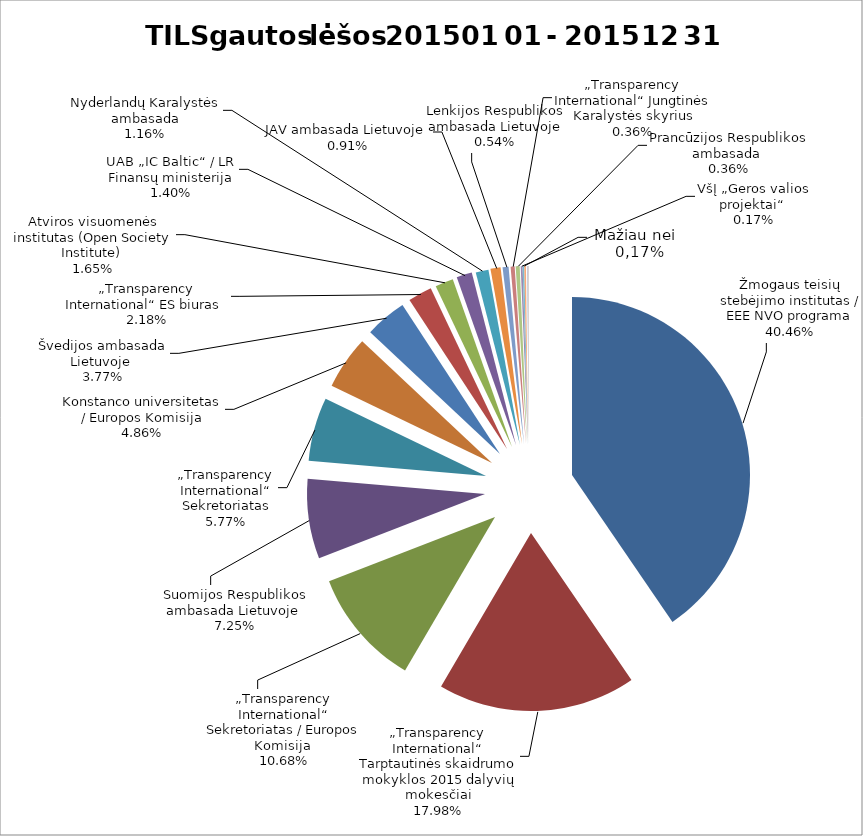
| Category | Series 0 |
|---|---|
| Žmogaus teisių stebėjimo institutas / EEE NVO programa | 0.405 |
| „Transparency International“ Tarptautinės skaidrumo mokyklos 2015 dalyvių mokesčiai | 0.18 |
| „Transparency International“ Sekretoriatas / Europos Komisija  | 0.107 |
| Suomijos Respublikos ambasada Lietuvoje  | 0.073 |
| „Transparency International“ Sekretoriatas | 0.058 |
| Konstanco universitetas / Europos Komisija | 0.049 |
| Švedijos ambasada Lietuvoje  | 0.038 |
| „Transparency International“ ES biuras  | 0.022 |
| Atviros visuomenės institutas (Open Society Institute)  | 0.016 |
| UAB „IC Baltic“ / LR Finansų ministerija | 0.014 |
| Nyderlandų Karalystės ambasada | 0.012 |
| JAV ambasada Lietuvoje  | 0.009 |
| Lenkijos Respublikos ambasada Lietuvoje | 0.005 |
| „Transparency International“ Jungtinės Karalystės skyrius | 0.004 |
| Prancūzijos Respublikos ambasada  | 0.004 |
| VšĮ „Geros valios projektai“  | 0.002 |
| Aukos (fizinių asmenų)  | 0.002 |
| TILS skirtas gyventojų pajamų mokestis  | 0.001 |
| UAB „Idea Prima“ | 0.001 |
| VšĮ „Socialinės integracijos projektai“ | 0 |
| UAB „Farmacijos namai“ | 0 |
| Lietuvos Respublikos vidaus reikalų ministerija | 0 |